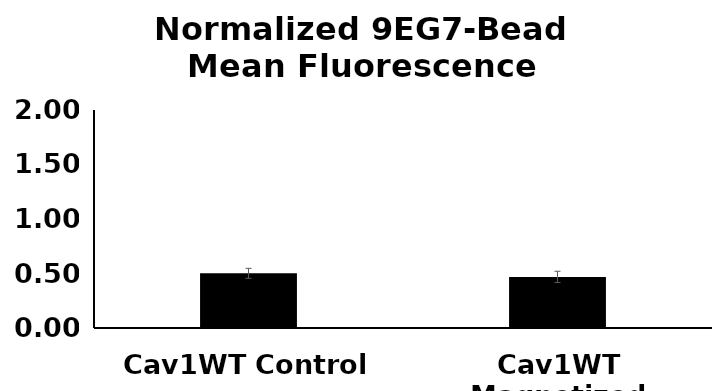
| Category | Series 0 |
|---|---|
| Cav1WT Control | 0.501 |
| Cav1WT Magnetized | 0.469 |